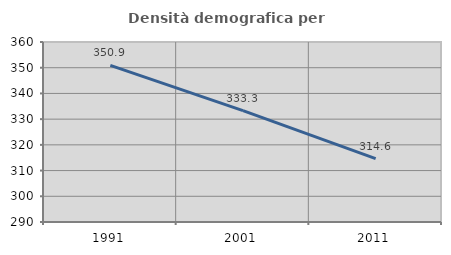
| Category | Densità demografica |
|---|---|
| 1991.0 | 350.907 |
| 2001.0 | 333.333 |
| 2011.0 | 314.644 |